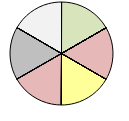
| Category | Series 1 |
|---|---|
| + + | 0 |
| + | 1 |
| o | 0 |
| - | 0 |
| - - | 0 |
| + + | 0 |
| + | 0 |
| o | 0 |
| - | 1 |
| - - | 0 |
| + + | 0 |
| + | 0 |
| o | 1 |
| - | 0 |
| - - | 0 |
| + + | 0 |
| + | 0 |
| o | 0 |
| - | 1 |
| - - | 0 |
| * * | 0 |
| * | 1 |
| o | 0 |
| * * | 0 |
| * | 0 |
| o | 1 |